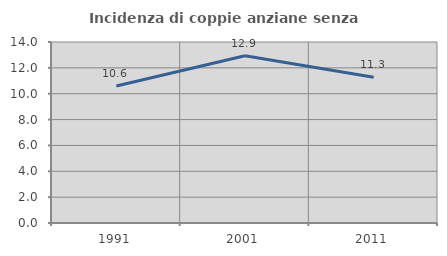
| Category | Incidenza di coppie anziane senza figli  |
|---|---|
| 1991.0 | 10.593 |
| 2001.0 | 12.932 |
| 2011.0 | 11.273 |